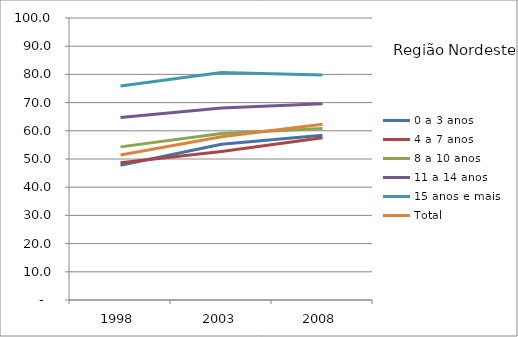
| Category | 0 a 3 anos | 4 a 7 anos | 8 a 10 anos | 11 a 14 anos | 15 anos e mais | Total |
|---|---|---|---|---|---|---|
| 1998.0 | 47.8 | 48.7 | 54.3 | 64.7 | 75.9 | 51.4 |
| 2003.0 | 55.2 | 52.7 | 59 | 68.1 | 80.7 | 57.9 |
| 2008.0 | 58.4 | 57.5 | 60.8 | 69.6 | 79.8 | 62.3 |